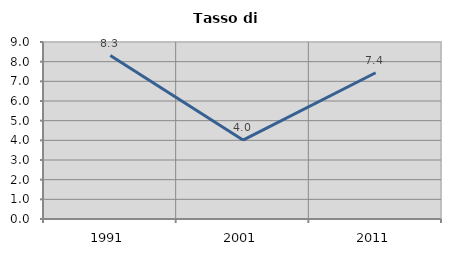
| Category | Tasso di disoccupazione   |
|---|---|
| 1991.0 | 8.313 |
| 2001.0 | 4.012 |
| 2011.0 | 7.436 |